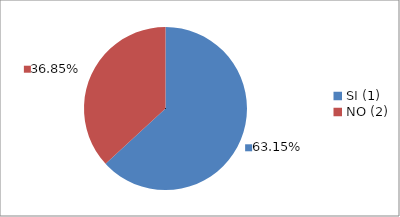
| Category | Series 0 |
|---|---|
| SI (1) | 0.632 |
| NO (2) | 0.368 |